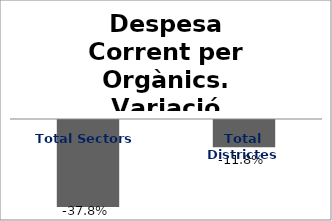
| Category | Series 0 |
|---|---|
| Total Sectors | -0.378 |
| Total Districtes | -0.118 |